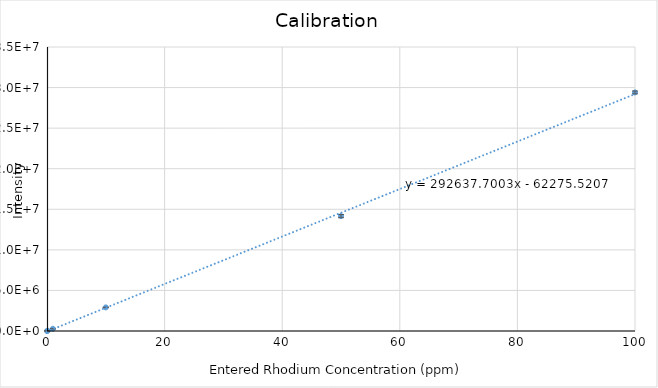
| Category | Calibration |
|---|---|
| 0.0 | 0 |
| 0.1 | 26672.3 |
| 1.0 | 272170.7 |
| 10.0 | 2909606.9 |
| 50.0 | 14161119.1 |
| 100.0 | 29400711.4 |